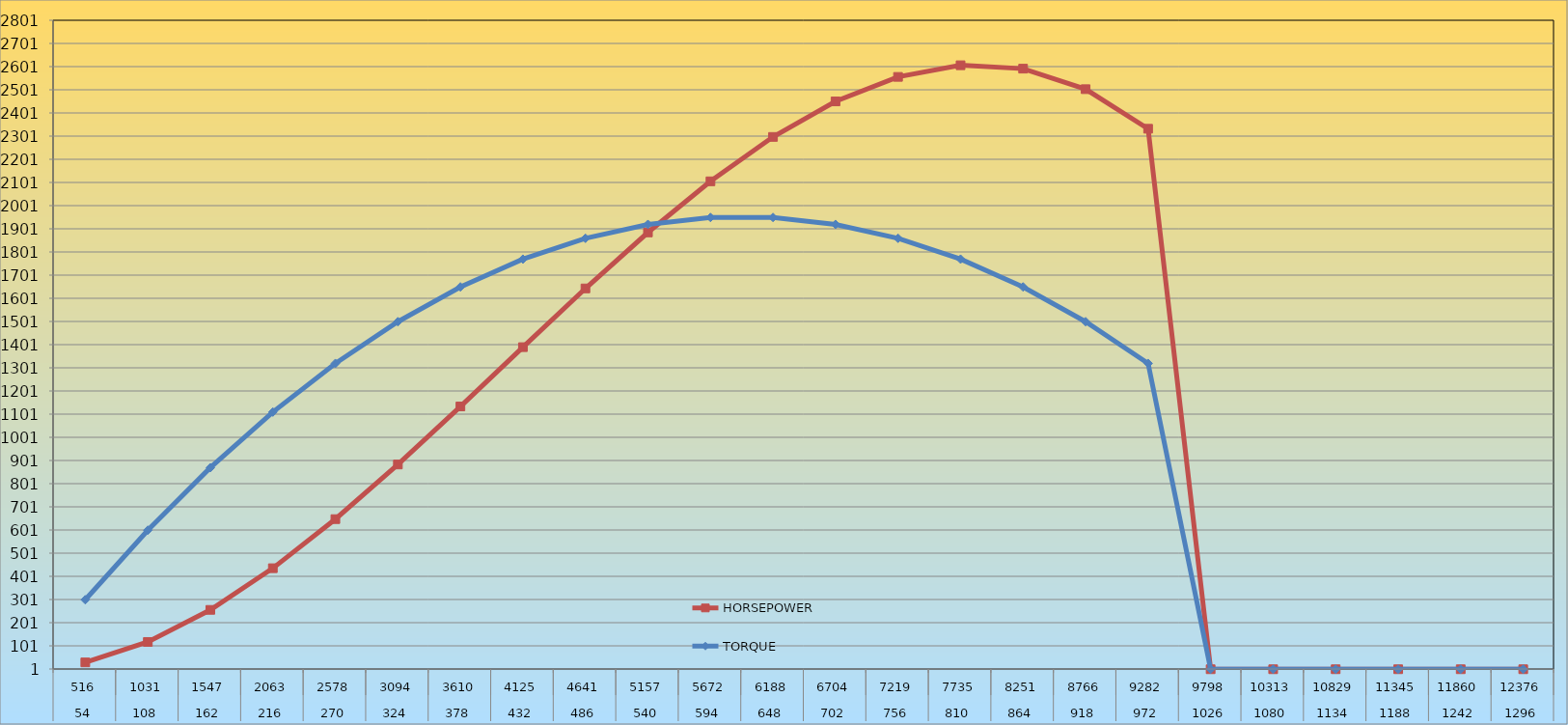
| Category | HORSEPOWER | TORQUE |
|---|---|---|
| 0 | 29.474 | 300 |
| 1 | 117.784 | 600 |
| 2 | 256.262 | 870 |
| 3 | 436.011 | 1110 |
| 4 | 647.936 | 1320 |
| 5 | 883.663 | 1500 |
| 6 | 1134.139 | 1650 |
| 7 | 1390.185 | 1770 |
| 8 | 1643.614 | 1860 |
| 9 | 1885.27 | 1920 |
| 10 | 2105.941 | 1950 |
| 11 | 2297.525 | 1950 |
| 12 | 2450.815 | 1920 |
| 13 | 2556.615 | 1860 |
| 14 | 2606.807 | 1770 |
| 15 | 2592.184 | 1650 |
| 16 | 2503.618 | 1500 |
| 17 | 2332.871 | 1320 |
| 18 | 0 | 0 |
| 19 | 0 | 0 |
| 20 | 0 | 0 |
| 21 | 0 | 0 |
| 22 | 0 | 0 |
| 23 | 0 | 0 |